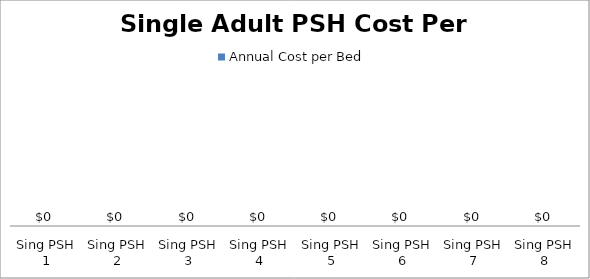
| Category | Annual Cost per Bed |
|---|---|
| Sing PSH 1 | 0 |
| Sing PSH 2 | 0 |
| Sing PSH 3 | 0 |
| Sing PSH 4 | 0 |
| Sing PSH 5 | 0 |
| Sing PSH 6 | 0 |
| Sing PSH 7 | 0 |
| Sing PSH 8 | 0 |